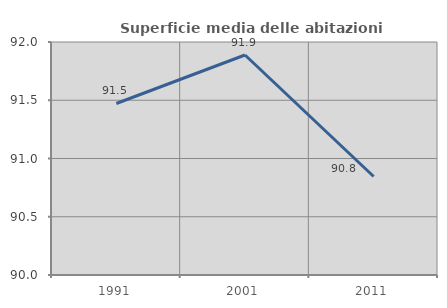
| Category | Superficie media delle abitazioni occupate |
|---|---|
| 1991.0 | 91.472 |
| 2001.0 | 91.888 |
| 2011.0 | 90.846 |